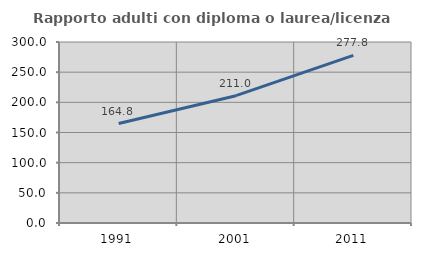
| Category | Rapporto adulti con diploma o laurea/licenza media  |
|---|---|
| 1991.0 | 164.813 |
| 2001.0 | 210.99 |
| 2011.0 | 277.823 |